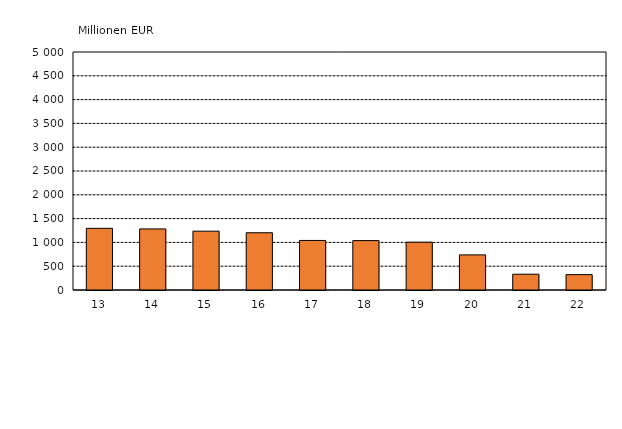
| Category | Series 0 |
|---|---|
| 13 | 1295.556 |
| 14 | 1283.11 |
| 15 | 1235.825 |
| 16 | 1202.554 |
| 17 | 1040.935 |
| 18 | 1037.687 |
| 19 | 1004.139 |
| 20 | 737.679 |
| 21 | 331.438 |
| 22 | 322.693 |